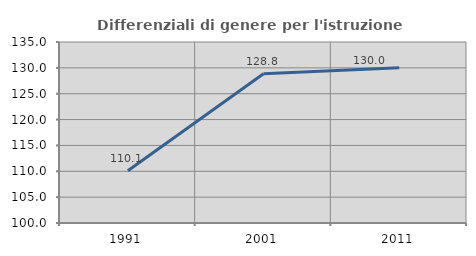
| Category | Differenziali di genere per l'istruzione superiore |
|---|---|
| 1991.0 | 110.104 |
| 2001.0 | 128.85 |
| 2011.0 | 130.004 |